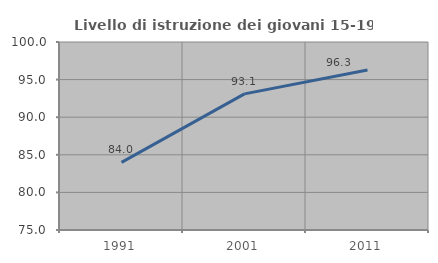
| Category | Livello di istruzione dei giovani 15-19 anni |
|---|---|
| 1991.0 | 83.993 |
| 2001.0 | 93.101 |
| 2011.0 | 96.278 |